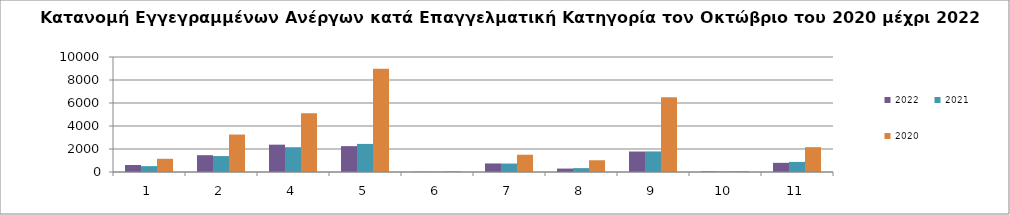
| Category | 2022 | 2021 | 2020 |
|---|---|---|---|
| 1.0 | 607 | 511 | 1150 |
| 2.0 | 1461 | 1386 | 3258 |
| 4.0 | 2376 | 2155 | 5110 |
| 5.0 | 2249 | 2443 | 8968 |
| 6.0 | 22 | 23 | 67 |
| 7.0 | 744 | 735 | 1502 |
| 8.0 | 298 | 337 | 1021 |
| 9.0 | 1782 | 1788 | 6493 |
| 10.0 | 50 | 39 | 78 |
| 11.0 | 796 | 876 | 2160 |